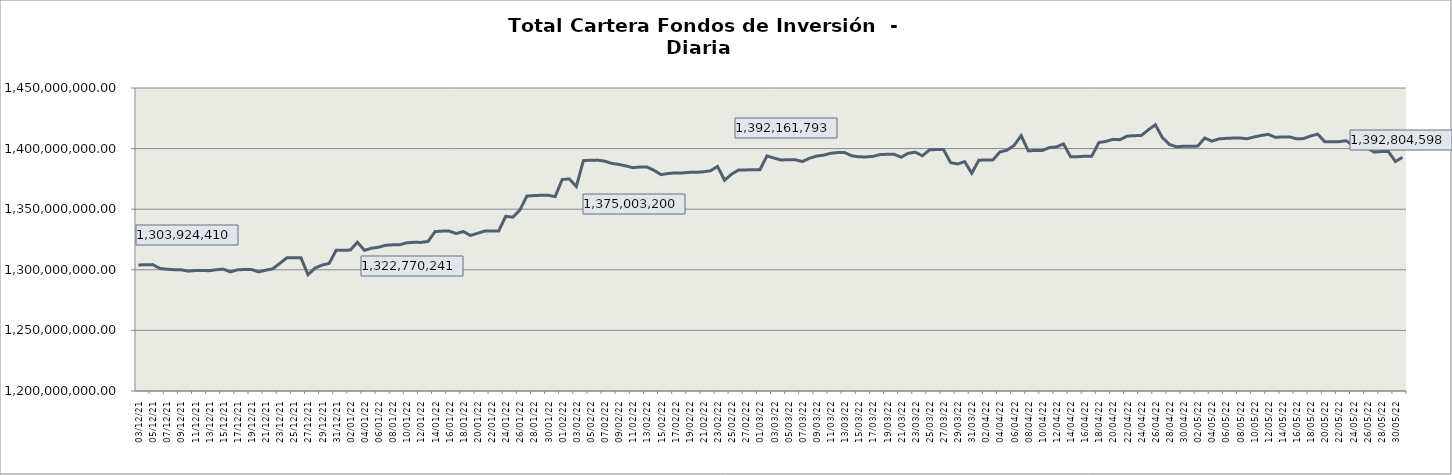
| Category | Cartera |
|---|---|
| 2021-12-03 | 1303924409.644 |
| 2021-12-04 | 1304242255.048 |
| 2021-12-05 | 1304271604.24 |
| 2021-12-06 | 1301192100.06 |
| 2021-12-07 | 1300476447.101 |
| 2021-12-08 | 1300066387.834 |
| 2021-12-09 | 1300033483.648 |
| 2021-12-10 | 1298908365.06 |
| 2021-12-11 | 1299352288.511 |
| 2021-12-12 | 1299382010.669 |
| 2021-12-13 | 1299280217.739 |
| 2021-12-14 | 1300070677.423 |
| 2021-12-15 | 1300570773.91 |
| 2021-12-16 | 1298268278.757 |
| 2021-12-17 | 1299934182.343 |
| 2021-12-18 | 1300273218.37 |
| 2021-12-19 | 1300302956.551 |
| 2021-12-20 | 1298252568.879 |
| 2021-12-21 | 1299625094.802 |
| 2021-12-22 | 1300788781.27 |
| 2021-12-23 | 1305274110.774 |
| 2021-12-24 | 1309891749.192 |
| 2021-12-25 | 1309904606.519 |
| 2021-12-26 | 1309932809.767 |
| 2021-12-27 | 1295907381.18 |
| 2021-12-28 | 1301436841.302 |
| 2021-12-29 | 1303924554.804 |
| 2021-12-30 | 1305283902.71 |
| 2021-12-31 | 1316184490.176 |
| 2022-01-01 | 1316211843.294 |
| 2022-01-02 | 1316243386.665 |
| 2022-01-03 | 1322770240.629 |
| 2022-01-04 | 1316040443.679 |
| 2022-01-05 | 1317850878.381 |
| 2022-01-06 | 1318642047.364 |
| 2022-01-07 | 1320256076.031 |
| 2022-01-08 | 1320600162.526 |
| 2022-01-09 | 1320628866.861 |
| 2022-01-10 | 1322278196.895 |
| 2022-01-11 | 1322707227.581 |
| 2022-01-12 | 1322594679.647 |
| 2022-01-13 | 1323364628.454 |
| 2022-01-14 | 1331548835.302 |
| 2022-01-15 | 1331927148.625 |
| 2022-01-16 | 1331957210.438 |
| 2022-01-17 | 1329902899.111 |
| 2022-01-18 | 1331589525.175 |
| 2022-01-19 | 1328308463.271 |
| 2022-01-20 | 1330111104.319 |
| 2022-01-21 | 1331909380.413 |
| 2022-01-22 | 1331938272.687 |
| 2022-01-23 | 1331971339.894 |
| 2022-01-24 | 1344124649.934 |
| 2022-01-25 | 1343432705.881 |
| 2022-01-26 | 1349281027.126 |
| 2022-01-27 | 1360836694.561 |
| 2022-01-28 | 1361242609.806 |
| 2022-01-29 | 1361465071.458 |
| 2022-01-30 | 1361496526.788 |
| 2022-01-31 | 1360359071.592 |
| 2022-02-01 | 1374491938.486 |
| 2022-02-02 | 1375003200.275 |
| 2022-02-03 | 1368749586.077 |
| 2022-02-04 | 1390047154.024 |
| 2022-02-05 | 1390466263.168 |
| 2022-02-06 | 1390493133.804 |
| 2022-02-07 | 1389661530.598 |
| 2022-02-08 | 1387841439.015 |
| 2022-02-09 | 1386967232.908 |
| 2022-02-10 | 1385697830.135 |
| 2022-02-11 | 1384280529.959 |
| 2022-02-12 | 1384782773.66 |
| 2022-02-13 | 1384810985.995 |
| 2022-02-14 | 1382103711.351 |
| 2022-02-15 | 1378497223.561 |
| 2022-02-16 | 1379445586.797 |
| 2022-02-17 | 1379972597.136 |
| 2022-02-18 | 1379896595.21 |
| 2022-02-19 | 1380388594.726 |
| 2022-02-20 | 1380415255.376 |
| 2022-02-21 | 1380868390.153 |
| 2022-02-22 | 1381702362.576 |
| 2022-02-23 | 1385324422 |
| 2022-02-24 | 1373886939.944 |
| 2022-02-25 | 1378935377.595 |
| 2022-02-26 | 1382396431.882 |
| 2022-02-27 | 1382426139.772 |
| 2022-02-28 | 1382525281.505 |
| 2022-03-01 | 1382554064.102 |
| 2022-03-02 | 1393949113.562 |
| 2022-03-03 | 1392161793.16 |
| 2022-03-04 | 1390617449.473 |
| 2022-03-05 | 1390781180.033 |
| 2022-03-06 | 1390811646.73 |
| 2022-03-07 | 1389297392.481 |
| 2022-03-08 | 1391949373.81 |
| 2022-03-09 | 1393808868.403 |
| 2022-03-10 | 1394571284.865 |
| 2022-03-11 | 1396121725.493 |
| 2022-03-12 | 1396735347.689 |
| 2022-03-13 | 1396765837.89 |
| 2022-03-14 | 1394056938.433 |
| 2022-03-15 | 1393195638.861 |
| 2022-03-16 | 1393140937.753 |
| 2022-03-17 | 1393588472.731 |
| 2022-03-18 | 1395042213.008 |
| 2022-03-19 | 1395311967.001 |
| 2022-03-20 | 1395344447.646 |
| 2022-03-21 | 1392894365.783 |
| 2022-03-22 | 1396123903.771 |
| 2022-03-23 | 1397032027.685 |
| 2022-03-24 | 1394061139.06 |
| 2022-03-25 | 1398885355.592 |
| 2022-03-26 | 1399257335.511 |
| 2022-03-27 | 1399289979.18 |
| 2022-03-28 | 1388446144.17 |
| 2022-03-29 | 1387295369.923 |
| 2022-03-30 | 1389249618.881 |
| 2022-03-31 | 1379735595.589 |
| 2022-04-01 | 1390389109.5 |
| 2022-04-02 | 1390662654.421 |
| 2022-04-03 | 1390695962.709 |
| 2022-04-04 | 1397247252.926 |
| 2022-04-05 | 1398674253.091 |
| 2022-04-06 | 1402682418.587 |
| 2022-04-07 | 1410700835.967 |
| 2022-04-08 | 1398156791.162 |
| 2022-04-09 | 1398463364.167 |
| 2022-04-10 | 1398475757.145 |
| 2022-04-11 | 1400831201.914 |
| 2022-04-12 | 1401377070.086 |
| 2022-04-13 | 1403887911.821 |
| 2022-04-14 | 1393266798.125 |
| 2022-04-15 | 1393300944.933 |
| 2022-04-16 | 1393718668.105 |
| 2022-04-17 | 1393752888.028 |
| 2022-04-18 | 1404946258.462 |
| 2022-04-19 | 1405913894.299 |
| 2022-04-20 | 1407637808.073 |
| 2022-04-21 | 1407352126.582 |
| 2022-04-22 | 1410266822.529 |
| 2022-04-23 | 1410692959.374 |
| 2022-04-24 | 1410727120.572 |
| 2022-04-25 | 1415448875.09 |
| 2022-04-26 | 1419715952.289 |
| 2022-04-27 | 1409103939.401 |
| 2022-04-28 | 1403442905.844 |
| 2022-04-29 | 1401506904.637 |
| 2022-04-30 | 1401975197.847 |
| 2022-05-01 | 1402011254.309 |
| 2022-05-02 | 1402048612.743 |
| 2022-05-03 | 1408713179.619 |
| 2022-05-04 | 1406118049.133 |
| 2022-05-05 | 1408002482.193 |
| 2022-05-06 | 1408449945.005 |
| 2022-05-07 | 1408691297.145 |
| 2022-05-08 | 1408725920.572 |
| 2022-05-09 | 1408134353.289 |
| 2022-05-10 | 1409623017.444 |
| 2022-05-11 | 1410853157.291 |
| 2022-05-12 | 1411761805.364 |
| 2022-05-13 | 1409260420.094 |
| 2022-05-14 | 1409637997.115 |
| 2022-05-15 | 1409675435.181 |
| 2022-05-16 | 1408077652.575 |
| 2022-05-17 | 1408261378.639 |
| 2022-05-18 | 1410447507.827 |
| 2022-05-19 | 1411918498.775 |
| 2022-05-20 | 1405615074.161 |
| 2022-05-21 | 1405688210.995 |
| 2022-05-22 | 1405727364.265 |
| 2022-05-23 | 1406500605.962 |
| 2022-05-24 | 1402710249.858 |
| 2022-05-25 | 1403680266.484 |
| 2022-05-26 | 1400508214.239 |
| 2022-05-27 | 1397052383.596 |
| 2022-05-28 | 1397572860.463 |
| 2022-05-29 | 1397610293.459 |
| 2022-05-30 | 1389325635.526 |
| 2022-05-31 | 1392804597.983 |